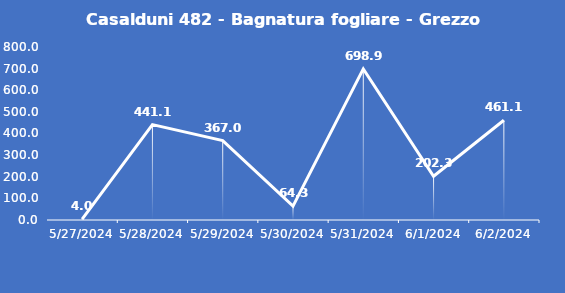
| Category | Casalduni 482 - Bagnatura fogliare - Grezzo (min) |
|---|---|
| 5/27/24 | 4 |
| 5/28/24 | 441.1 |
| 5/29/24 | 367 |
| 5/30/24 | 64.3 |
| 5/31/24 | 698.9 |
| 6/1/24 | 202.3 |
| 6/2/24 | 461.1 |